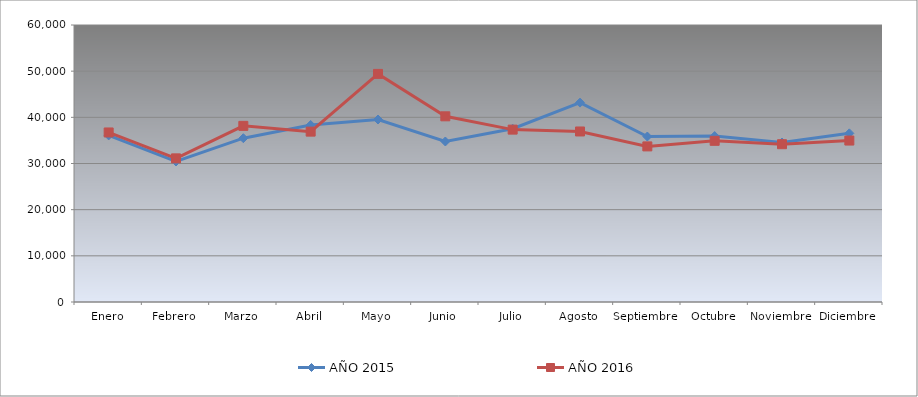
| Category | AÑO 2015 | AÑO 2016 |
|---|---|---|
| Enero | 36083.972 | 36722.279 |
| Febrero | 30431.465 | 31113.378 |
| Marzo | 35479.552 | 38150.835 |
| Abril | 38344.074 | 36903.79 |
| Mayo | 39530.402 | 49407.852 |
| Junio | 34765.954 | 40220.279 |
| Julio | 37541.557 | 37339.639 |
| Agosto | 43188.436 | 36935.162 |
| Septiembre | 35844.23 | 33704.946 |
| Octubre | 35939.901 | 34912.776 |
| Noviembre | 34548.723 | 34178.89 |
| Diciembre | 36529.689 | 34969.918 |